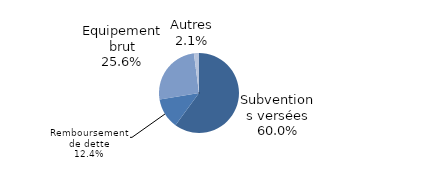
| Category | Series 0 |
|---|---|
| Subventions versées | 0.6 |
| Remboursement de dette | 0.124 |
| Equipement brut | 0.256 |
| Autres | 0.021 |